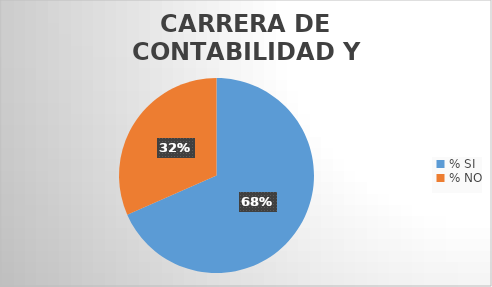
| Category | Series 0 |
|---|---|
| % SI | 68.421 |
| % NO | 31.579 |